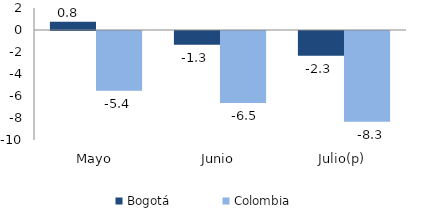
| Category | Bogotá | Colombia |
|---|---|---|
| Mayo | 0.75 | -5.434 |
| Junio | -1.26 | -6.546 |
| Julio(p) | -2.252 | -8.259 |